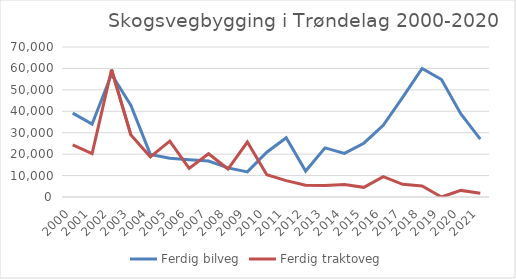
| Category | Ferdig bilveg | Ferdig traktoveg |
|---|---|---|
| 2000.0 | 39123 | 24311 |
| 2001.0 | 34021 | 20203 |
| 2002.0 | 57267 | 59477 |
| 2003.0 | 42714 | 28887 |
| 2004.0 | 19885 | 18730 |
| 2005.0 | 18053 | 26087 |
| 2006.0 | 17403 | 13316 |
| 2007.0 | 16772 | 20187 |
| 2008.0 | 13590 | 13050 |
| 2009.0 | 11710 | 25640 |
| 2010.0 | 20889 | 10400 |
| 2011.0 | 27636 | 7650 |
| 2012.0 | 12120 | 5475 |
| 2013.0 | 22914 | 5350 |
| 2014.0 | 20371 | 5850 |
| 2015.0 | 25101 | 4500 |
| 2016.0 | 33467 | 9510 |
| 2017.0 | 46517 | 5919 |
| 2018.0 | 59969 | 5105 |
| 2019.0 | 54825 | 0 |
| 2020.0 | 38741 | 3080 |
| 2021.0 | 27037 | 1720 |